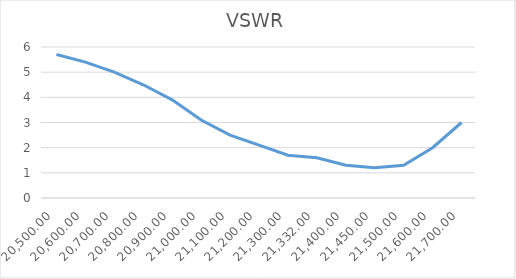
| Category | VSWR |
|---|---|
| 20500.0 | 5.7 |
| 20600.0 | 5.4 |
| 20700.0 | 5 |
| 20800.0 | 4.5 |
| 20900.0 | 3.9 |
| 21000.0 | 3.1 |
| 21100.0 | 2.5 |
| 21200.0 | 2.1 |
| 21300.0 | 1.7 |
| 21332.0 | 1.6 |
| 21400.0 | 1.3 |
| 21450.0 | 1.2 |
| 21500.0 | 1.3 |
| 21600.0 | 2 |
| 21700.0 | 3 |